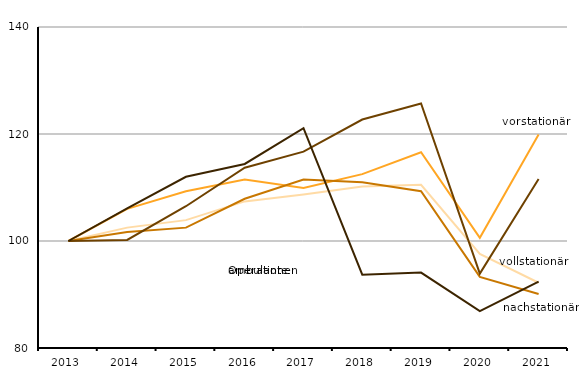
| Category | Vorstationäre Behandlungsfälle   | Vollstationäre Fallzahl  | Nachstationäre Behandlungsfälle   | Teilstationäre Behandlungsfälle   | Ambulante Operationen nach §115b SGB V  |
|---|---|---|---|---|---|
| 2013.0 | 100 | 100 | 100 | 100 | 100 |
| 2014.0 | 106 | 102.5 | 101.7 | 100.2 | 106.1 |
| 2015.0 | 109.3 | 103.9 | 102.5 | 106.5 | 112 |
| 2016.0 | 111.5 | 107.4 | 107.9 | 113.7 | 114.4 |
| 2017.0 | 109.9 | 108.7 | 111.5 | 116.7 | 121.1 |
| 2018.0 | 112.5 | 110.2 | 111 | 122.7 | 93.7 |
| 2019.0 | 116.6 | 110.5 | 109.3 | 125.7 | 94.1 |
| 2020.0 | 100.6 | 97.6 | 93.3 | 93.9 | 86.9 |
| 2021.0 | 119.9 | 92.2 | 90.1 | 111.6 | 92.4 |